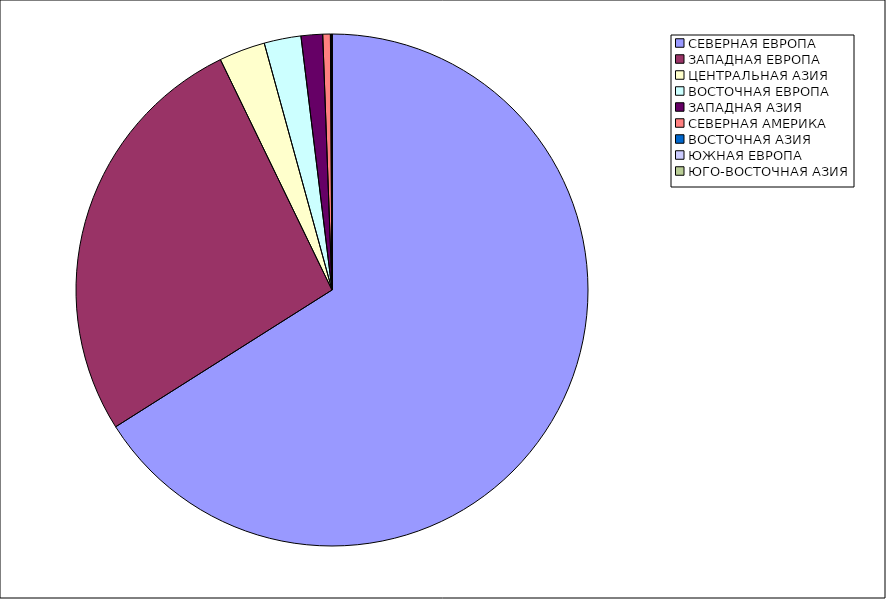
| Category | Оборот |
|---|---|
| СЕВЕРНАЯ ЕВРОПА | 66.024 |
| ЗАПАДНАЯ ЕВРОПА | 26.796 |
| ЦЕНТРАЛЬНАЯ АЗИЯ | 2.915 |
| ВОСТОЧНАЯ ЕВРОПА | 2.325 |
| ЗАПАДНАЯ АЗИЯ | 1.36 |
| СЕВЕРНАЯ АМЕРИКА | 0.48 |
| ВОСТОЧНАЯ АЗИЯ | 0.097 |
| ЮЖНАЯ ЕВРОПА | 0.001 |
| ЮГО-ВОСТОЧНАЯ АЗИЯ | 0.001 |